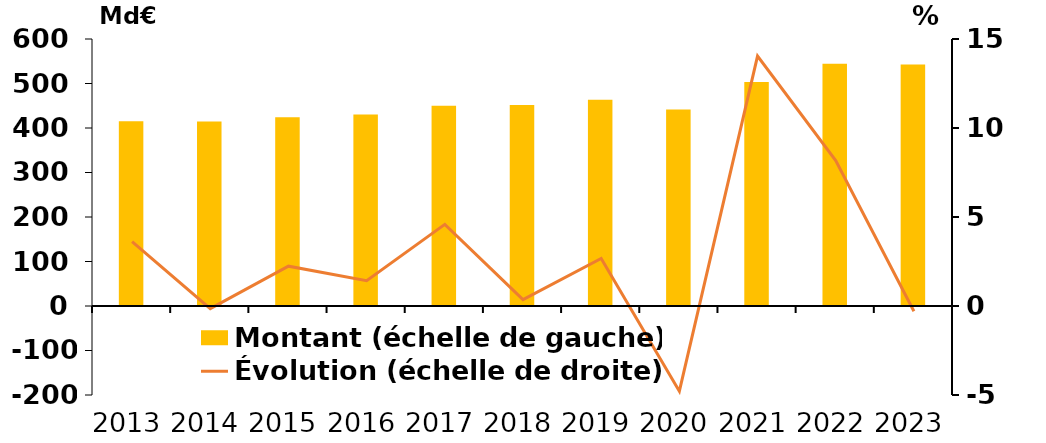
| Category | Montant (échelle de gauche) |
|---|---|
| 2013 | 415.427 |
| 2014 | 414.8 |
| 2015 | 424.08 |
| 2016 | 430.131 |
| 2017 | 449.85 |
| 2018 | 451.48 |
| 2019 | 463.518 |
| 2020 | 441.331 |
| 2021 | 503.303 |
| 2022 | 544.447 |
| 2023 | 542.82 |